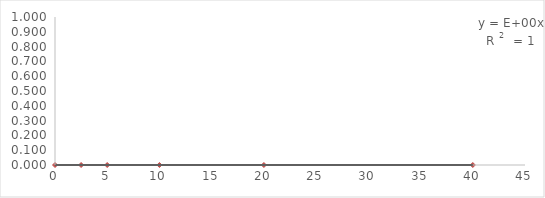
| Category | Series 0 |
|---|---|
| 40.0 | 0 |
| 20.0 | 0 |
| 10.0 | 0 |
| 5.0 | 0 |
| 2.5 | 0 |
| 0.0 | 0 |